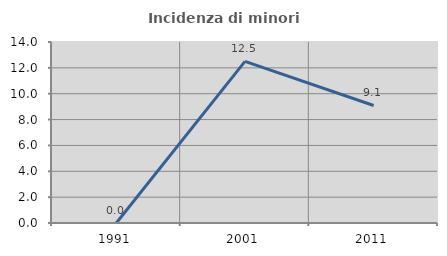
| Category | Incidenza di minori stranieri |
|---|---|
| 1991.0 | 0 |
| 2001.0 | 12.5 |
| 2011.0 | 9.091 |